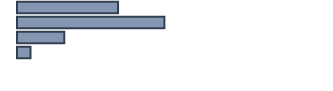
| Category | Series 0 |
|---|---|
| 0 | 32.7 |
| 1 | 47.7 |
| 2 | 15.3 |
| 3 | 4.4 |
| 4 | 0 |